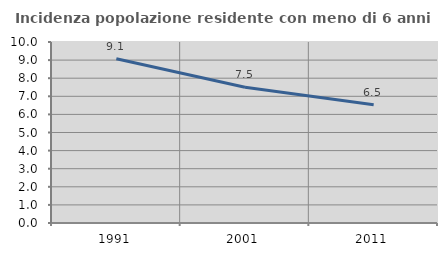
| Category | Incidenza popolazione residente con meno di 6 anni |
|---|---|
| 1991.0 | 9.078 |
| 2001.0 | 7.505 |
| 2011.0 | 6.532 |